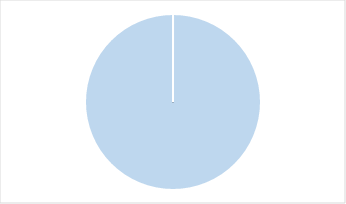
| Category | Series 0 |
|---|---|
| 0 | 0 |
| 1 | 0 |
| 2 | 1 |
| 3 | 0 |
| 4 | 0 |